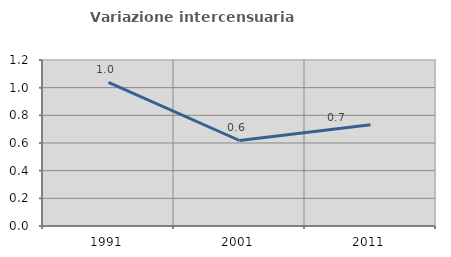
| Category | Variazione intercensuaria annua |
|---|---|
| 1991.0 | 1.038 |
| 2001.0 | 0.618 |
| 2011.0 | 0.732 |